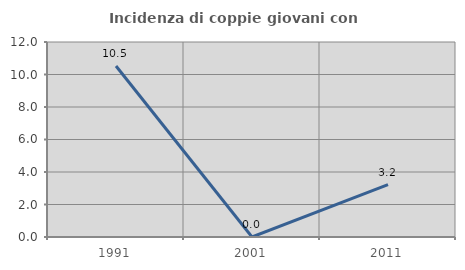
| Category | Incidenza di coppie giovani con figli |
|---|---|
| 1991.0 | 10.526 |
| 2001.0 | 0 |
| 2011.0 | 3.226 |